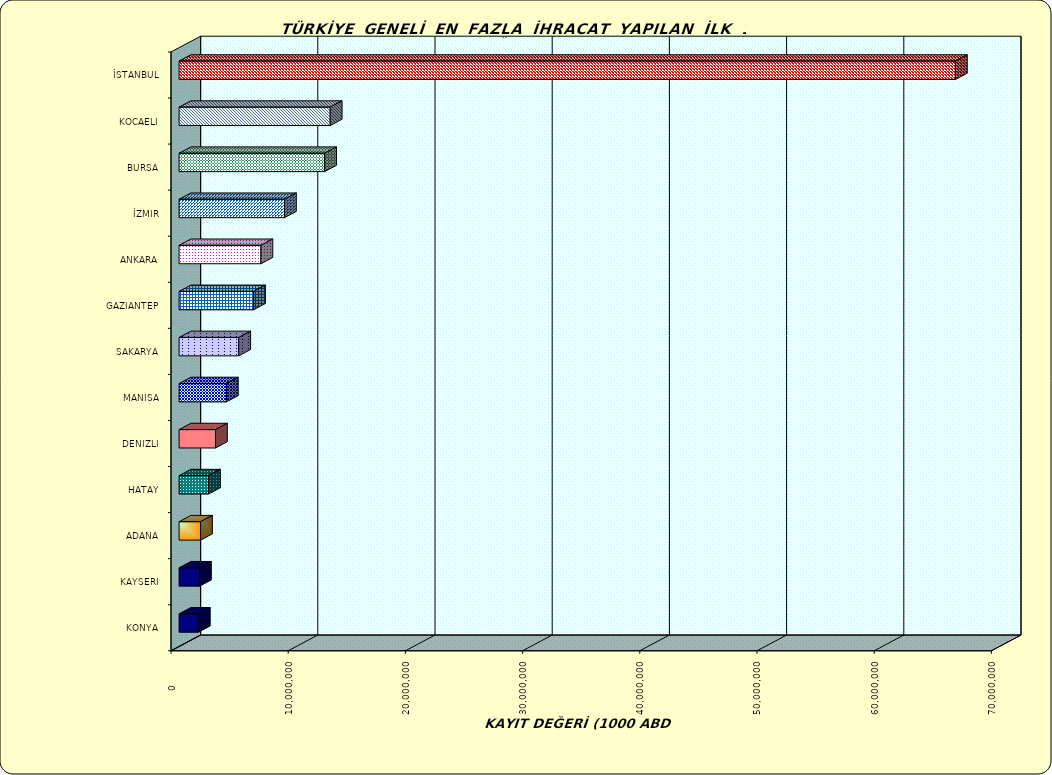
| Category | Series 0 |
|---|---|
| İSTANBUL | 66239190.12 |
| KOCAELI | 12895819.393 |
| BURSA | 12420881.143 |
| İZMIR | 8993665.783 |
| ANKARA | 6986644.781 |
| GAZIANTEP | 6356674.918 |
| SAKARYA | 5090887.292 |
| MANISA | 4033209.935 |
| DENIZLI | 3107110.692 |
| HATAY | 2513620.379 |
| ADANA | 1833017.108 |
| KAYSERI | 1743024.13 |
| KONYA | 1641918.059 |